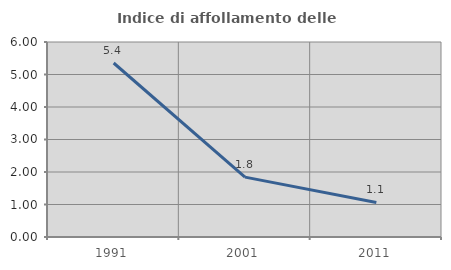
| Category | Indice di affollamento delle abitazioni  |
|---|---|
| 1991.0 | 5.354 |
| 2001.0 | 1.842 |
| 2011.0 | 1.064 |